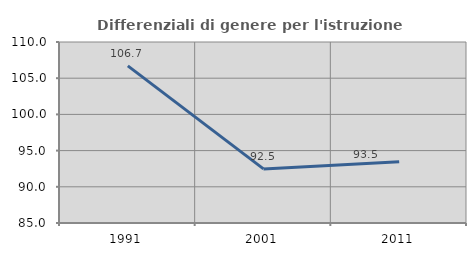
| Category | Differenziali di genere per l'istruzione superiore |
|---|---|
| 1991.0 | 106.707 |
| 2001.0 | 92.475 |
| 2011.0 | 93.457 |